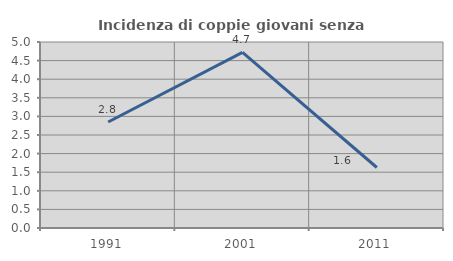
| Category | Incidenza di coppie giovani senza figli |
|---|---|
| 1991.0 | 2.849 |
| 2001.0 | 4.722 |
| 2011.0 | 1.626 |